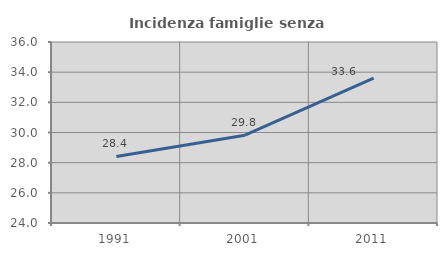
| Category | Incidenza famiglie senza nuclei |
|---|---|
| 1991.0 | 28.409 |
| 2001.0 | 29.819 |
| 2011.0 | 33.599 |